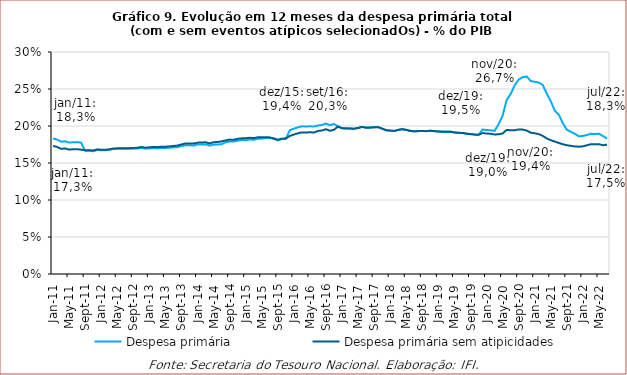
| Category | Despesa primária | Despesa primária sem atipicidades |
|---|---|---|
| 2011-01-01 | 0.183 | 0.173 |
| 2011-02-01 | 0.182 | 0.172 |
| 2011-03-01 | 0.179 | 0.169 |
| 2011-04-01 | 0.179 | 0.17 |
| 2011-05-01 | 0.178 | 0.168 |
| 2011-06-01 | 0.178 | 0.169 |
| 2011-07-01 | 0.178 | 0.169 |
| 2011-08-01 | 0.177 | 0.168 |
| 2011-09-01 | 0.166 | 0.167 |
| 2011-10-01 | 0.167 | 0.167 |
| 2011-11-01 | 0.166 | 0.167 |
| 2011-12-01 | 0.168 | 0.168 |
| 2012-01-01 | 0.167 | 0.168 |
| 2012-02-01 | 0.167 | 0.168 |
| 2012-03-01 | 0.168 | 0.168 |
| 2012-04-01 | 0.169 | 0.17 |
| 2012-05-01 | 0.169 | 0.17 |
| 2012-06-01 | 0.169 | 0.17 |
| 2012-07-01 | 0.169 | 0.17 |
| 2012-08-01 | 0.169 | 0.17 |
| 2012-09-01 | 0.169 | 0.17 |
| 2012-10-01 | 0.169 | 0.17 |
| 2012-11-01 | 0.171 | 0.172 |
| 2012-12-01 | 0.169 | 0.171 |
| 2013-01-01 | 0.17 | 0.171 |
| 2013-02-01 | 0.17 | 0.172 |
| 2013-03-01 | 0.17 | 0.171 |
| 2013-04-01 | 0.17 | 0.172 |
| 2013-05-01 | 0.17 | 0.172 |
| 2013-06-01 | 0.171 | 0.173 |
| 2013-07-01 | 0.171 | 0.173 |
| 2013-08-01 | 0.171 | 0.174 |
| 2013-09-01 | 0.173 | 0.175 |
| 2013-10-01 | 0.174 | 0.176 |
| 2013-11-01 | 0.174 | 0.176 |
| 2013-12-01 | 0.173 | 0.176 |
| 2014-01-01 | 0.175 | 0.177 |
| 2014-02-01 | 0.175 | 0.178 |
| 2014-03-01 | 0.175 | 0.178 |
| 2014-04-01 | 0.173 | 0.176 |
| 2014-05-01 | 0.175 | 0.178 |
| 2014-06-01 | 0.175 | 0.178 |
| 2014-07-01 | 0.175 | 0.179 |
| 2014-08-01 | 0.178 | 0.181 |
| 2014-09-01 | 0.179 | 0.182 |
| 2014-10-01 | 0.179 | 0.181 |
| 2014-11-01 | 0.18 | 0.183 |
| 2014-12-01 | 0.181 | 0.183 |
| 2015-01-01 | 0.181 | 0.184 |
| 2015-02-01 | 0.182 | 0.184 |
| 2015-03-01 | 0.181 | 0.184 |
| 2015-04-01 | 0.183 | 0.185 |
| 2015-05-01 | 0.183 | 0.185 |
| 2015-06-01 | 0.184 | 0.185 |
| 2015-07-01 | 0.184 | 0.184 |
| 2015-08-01 | 0.182 | 0.183 |
| 2015-09-01 | 0.181 | 0.181 |
| 2015-10-01 | 0.182 | 0.183 |
| 2015-11-01 | 0.183 | 0.183 |
| 2015-12-01 | 0.194 | 0.187 |
| 2016-01-01 | 0.196 | 0.188 |
| 2016-02-01 | 0.198 | 0.19 |
| 2016-03-01 | 0.2 | 0.191 |
| 2016-04-01 | 0.199 | 0.191 |
| 2016-05-01 | 0.2 | 0.192 |
| 2016-06-01 | 0.199 | 0.191 |
| 2016-07-01 | 0.201 | 0.193 |
| 2016-08-01 | 0.201 | 0.194 |
| 2016-09-01 | 0.203 | 0.196 |
| 2016-10-01 | 0.201 | 0.193 |
| 2016-11-01 | 0.203 | 0.195 |
| 2016-12-01 | 0.199 | 0.199 |
| 2017-01-01 | 0.197 | 0.197 |
| 2017-02-01 | 0.197 | 0.197 |
| 2017-03-01 | 0.197 | 0.197 |
| 2017-04-01 | 0.196 | 0.196 |
| 2017-05-01 | 0.197 | 0.197 |
| 2017-06-01 | 0.199 | 0.199 |
| 2017-07-01 | 0.198 | 0.198 |
| 2017-08-01 | 0.198 | 0.198 |
| 2017-09-01 | 0.198 | 0.198 |
| 2017-10-01 | 0.199 | 0.198 |
| 2017-11-01 | 0.196 | 0.196 |
| 2017-12-01 | 0.194 | 0.194 |
| 2018-01-01 | 0.194 | 0.194 |
| 2018-02-01 | 0.193 | 0.193 |
| 2018-03-01 | 0.195 | 0.195 |
| 2018-04-01 | 0.196 | 0.196 |
| 2018-05-01 | 0.195 | 0.195 |
| 2018-06-01 | 0.193 | 0.193 |
| 2018-07-01 | 0.193 | 0.193 |
| 2018-08-01 | 0.193 | 0.193 |
| 2018-09-01 | 0.193 | 0.193 |
| 2018-10-01 | 0.193 | 0.193 |
| 2018-11-01 | 0.194 | 0.194 |
| 2018-12-01 | 0.193 | 0.193 |
| 2019-01-01 | 0.193 | 0.192 |
| 2019-02-01 | 0.192 | 0.192 |
| 2019-03-01 | 0.192 | 0.192 |
| 2019-04-01 | 0.192 | 0.192 |
| 2019-05-01 | 0.191 | 0.191 |
| 2019-06-01 | 0.191 | 0.191 |
| 2019-07-01 | 0.191 | 0.191 |
| 2019-08-01 | 0.19 | 0.19 |
| 2019-09-01 | 0.189 | 0.189 |
| 2019-10-01 | 0.188 | 0.188 |
| 2019-11-01 | 0.188 | 0.188 |
| 2019-12-01 | 0.195 | 0.19 |
| 2020-01-01 | 0.195 | 0.19 |
| 2020-02-01 | 0.194 | 0.19 |
| 2020-03-01 | 0.193 | 0.189 |
| 2020-04-01 | 0.202 | 0.189 |
| 2020-05-01 | 0.214 | 0.19 |
| 2020-06-01 | 0.235 | 0.195 |
| 2020-07-01 | 0.243 | 0.194 |
| 2020-08-01 | 0.255 | 0.194 |
| 2020-09-01 | 0.263 | 0.195 |
| 2020-10-01 | 0.266 | 0.195 |
| 2020-11-01 | 0.267 | 0.194 |
| 2020-12-01 | 0.261 | 0.191 |
| 2021-01-01 | 0.26 | 0.19 |
| 2021-02-01 | 0.259 | 0.189 |
| 2021-03-01 | 0.255 | 0.187 |
| 2021-04-01 | 0.244 | 0.183 |
| 2021-05-01 | 0.233 | 0.181 |
| 2021-06-01 | 0.221 | 0.179 |
| 2021-07-01 | 0.215 | 0.177 |
| 2021-08-01 | 0.204 | 0.175 |
| 2021-09-01 | 0.195 | 0.174 |
| 2021-10-01 | 0.192 | 0.173 |
| 2021-11-01 | 0.19 | 0.172 |
| 2021-12-01 | 0.186 | 0.172 |
| 2022-01-01 | 0.187 | 0.173 |
| 2022-02-01 | 0.188 | 0.174 |
| 2022-03-01 | 0.19 | 0.175 |
| 2022-04-01 | 0.189 | 0.176 |
| 2022-05-01 | 0.19 | 0.175 |
| 2022-06-01 | 0.186 | 0.174 |
| 2022-07-01 | 0.183 | 0.175 |